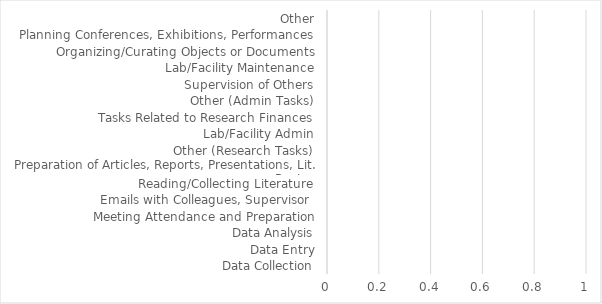
| Category | Series 0 | Series 1 | Series 2 | Series 3 |
|---|---|---|---|---|
| Data Collection |  |  |  | 0 |
| Data Entry |  |  |  | 0 |
| Data Analysis |  |  |  | 0 |
| Meeting Attendance and Preparation |  |  |  | 0 |
| Emails with Colleagues, Supervisor  |  |  |  | 0 |
| Reading/Collecting Literature |  |  |  | 0 |
| Preparation of Articles, Reports, Presentations, Lit. Review |  |  |  | 0 |
| Other (Research Tasks) |  |  |  | 0 |
| Lab/Facility Admin |  |  |  | 0 |
| Tasks Related to Research Finances |  |  |  | 0 |
| Other (Admin Tasks) |  |  |  | 0 |
| Supervision of Others |  |  |  | 0 |
| Lab/Facility Maintenance |  |  |  | 0 |
| Organizing/Curating Objects or Documents |  |  |  | 0 |
| Planning Conferences, Exhibitions, Performances |  |  |  | 0 |
| Other |  |  |  | 0 |